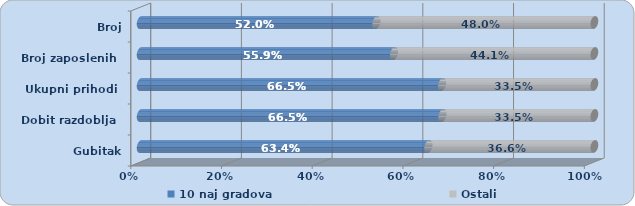
| Category | 10 naj gradova | Ostali |
|---|---|---|
| Gubitak razdoblja | 0.634 | 0.366 |
| Dobit razdoblja | 0.665 | 0.335 |
| Ukupni prihodi | 0.665 | 0.335 |
| Broj zaposlenih | 0.559 | 0.441 |
| Broj poduzetnika | 0.52 | 0.48 |